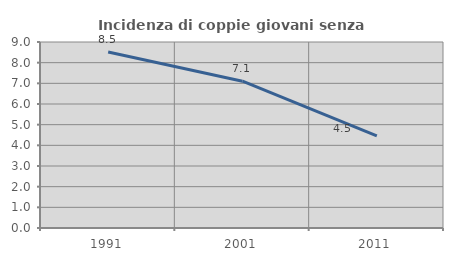
| Category | Incidenza di coppie giovani senza figli |
|---|---|
| 1991.0 | 8.518 |
| 2001.0 | 7.103 |
| 2011.0 | 4.457 |